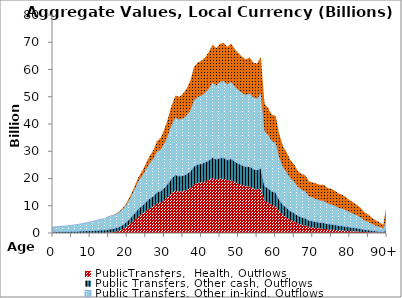
| Category | PublicTransfers,  Health, Outflows | Public Transfers, Other cash, Outflows | Public Transfers, Other in-kind, Outflows | Public Transfers, Education, Outflows |
|---|---|---|---|---|
| 0 | 0 | 473.343 | 1725.737 | 0 |
|  | 0 | 495.483 | 1806.456 | 0 |
| 2 | 0 | 530.702 | 1934.861 | 0 |
| 3 | 0 | 539.497 | 1966.926 | 0 |
| 4 | 0 | 565.119 | 2060.34 | 0 |
| 5 | 0 | 601.158 | 2191.732 | 0 |
| 6 | 0 | 642.344 | 2341.89 | 0 |
| 7 | 0 | 694.89 | 2533.466 | 0 |
| 8 | 0 | 749.066 | 2730.981 | 0 |
| 9 | 0 | 801.977 | 2923.888 | 0 |
| 10 | 0 | 870.494 | 3173.69 | 0 |
| 11 | 0 | 940.325 | 3428.285 | 0 |
| 12 | 0 | 1019.607 | 3717.333 | 0 |
| 13 | 0 | 1101.743 | 4016.789 | 0 |
| 14 | 0 | 1118.584 | 4078.189 | 0 |
| 15 | 123.052 | 1276.672 | 4654.556 | 30.855 |
| 16 | 243.058 | 1321.502 | 4818 | 65.382 |
| 17 | 488.22 | 1389.304 | 5065.194 | 140.833 |
| 18 | 922.684 | 1483.082 | 5407.097 | 272.293 |
| 19 | 1572.959 | 1587.089 | 5786.292 | 428.647 |
| 20 | 2517.777 | 1809.674 | 6597.798 | 615.915 |
| 21 | 3642.692 | 2078.601 | 7578.269 | 846.401 |
| 22 | 4881.677 | 2419.588 | 8821.455 | 1077.61 |
| 23 | 6121.604 | 2769.889 | 10098.6 | 1408.981 |
| 24 | 7040.591 | 2999.173 | 10934.539 | 1736.013 |
| 25 | 8022.767 | 3272.88 | 11932.431 | 2141.912 |
| 26 | 9024.517 | 3573.816 | 13029.598 | 2587.573 |
| 27 | 9728.164 | 3752.775 | 13682.055 | 3060.888 |
| 28 | 10858.4 | 4097.859 | 14940.189 | 3770.454 |
| 29 | 11239.76 | 4169.141 | 15200.07 | 4298.453 |
| 30 | 12141.252 | 4453.163 | 16235.557 | 5174.554 |
| 31 | 13352.646 | 4884.409 | 17807.825 | 6092.501 |
| 32 | 14730.764 | 5406.561 | 19711.516 | 7181.691 |
| 33 | 15608.759 | 5781.98 | 21080.237 | 7965.506 |
| 34 | 15222.742 | 5676.754 | 20696.593 | 8346.756 |
| 35 | 15369.639 | 5755.474 | 20983.601 | 8935.525 |
| 36 | 15755.172 | 5879.73 | 21436.609 | 9880.511 |
| 37 | 16506.831 | 6144.656 | 22402.5 | 10841.471 |
| 38 | 17903.228 | 6619.066 | 24132.133 | 12264.66 |
| 39 | 18417.139 | 6786.09 | 24741.075 | 12661.528 |
| 40 | 18616.672 | 6841.68 | 24943.741 | 12805.701 |
| 41 | 18978.143 | 6999.089 | 25517.634 | 12930.069 |
| 42 | 19492.546 | 7217.983 | 26315.679 | 13390.87 |
| 43 | 20151.112 | 7533.617 | 27466.435 | 13918.281 |
| 44 | 19644.629 | 7433.854 | 27102.711 | 13693.497 |
| 45 | 19926.167 | 7650.215 | 27891.538 | 13931.209 |
| 46 | 19893.94 | 7732.322 | 28190.886 | 14031.947 |
| 47 | 19291.758 | 7588.762 | 27667.486 | 13723.938 |
| 48 | 19493.275 | 7745.604 | 28239.319 | 14033.999 |
| 49 | 18735.867 | 7525.896 | 27438.292 | 13714.711 |
| 50 | 18142.488 | 7385.041 | 26924.755 | 13533.489 |
| 51 | 17576.497 | 7278.137 | 26534.995 | 13243.809 |
| 52 | 17104.579 | 7223.62 | 26336.244 | 13021.485 |
| 53 | 17068.359 | 7375.221 | 26888.958 | 13108.256 |
| 54 | 16308.222 | 7197.304 | 26240.287 | 12762.407 |
| 55 | 15962.039 | 7195.686 | 26234.398 | 12788.248 |
| 56 | 16336.086 | 7504.032 | 27358.575 | 13551.651 |
| 57 | 11785.069 | 5517.852 | 20117.264 | 10093.217 |
| 58 | 11142.241 | 5322.384 | 19404.62 | 9937.252 |
| 59 | 10283.939 | 5054.308 | 18427.253 | 9631.705 |
| 60 | 9852.324 | 5018.027 | 18294.982 | 9792.396 |
| 61 | 7910.587 | 4247.789 | 15486.805 | 8429.353 |
| 62 | 6583.27 | 3782.696 | 13791.144 | 7624.972 |
| 63 | 5690.138 | 3549.267 | 12940.096 | 7206.998 |
| 64 | 4816.669 | 3284.308 | 11974.09 | 6628.175 |
| 65 | 4184.445 | 3139.586 | 11446.462 | 6313.102 |
| 66 | 3500.435 | 2883.549 | 10512.988 | 5860.509 |
| 67 | 3057.751 | 2764.668 | 10079.567 | 5762.492 |
| 68 | 2742.726 | 2704.066 | 9858.616 | 5825.362 |
| 69 | 2248.334 | 2419.797 | 8822.219 | 5419.418 |
| 70 | 2022.275 | 2361.016 | 8607.907 | 5576.106 |
| 71 | 1816.971 | 2288.716 | 8344.317 | 5645.79 |
| 72 | 1648.334 | 2221.417 | 8098.955 | 5722.725 |
| 73 | 1534.708 | 2205.845 | 8042.18 | 5928.246 |
| 74 | 1338.678 | 2038.068 | 7430.491 | 5713.671 |
| 75 | 1234.868 | 1990.292 | 7256.312 | 5707.609 |
| 76 | 1113.753 | 1897.364 | 6917.505 | 5522.683 |
| 77 | 990.479 | 1783.197 | 6501.267 | 5242.211 |
| 78 | 908.301 | 1725.42 | 6290.619 | 5104.85 |
| 79 | 800.95 | 1604.128 | 5848.412 | 4772.335 |
| 80 | 691.104 | 1486.116 | 5418.156 | 4378.142 |
| 81 | 608.215 | 1390.766 | 5070.526 | 4111.269 |
| 82 | 522.368 | 1268.788 | 4625.81 | 3756.251 |
| 83 | 443.731 | 1123.614 | 4096.527 | 3402.68 |
| 84 | 345.07 | 925.427 | 3373.969 | 2830.7 |
| 85 | 296.116 | 819.941 | 2989.382 | 2609.535 |
| 86 | 234.001 | 664.145 | 2421.372 | 2212.107 |
| 87 | 192.186 | 540.666 | 1971.186 | 1936.39 |
| 88 | 161.27 | 435.866 | 1589.101 | 1705.281 |
| 89 | 130.267 | 330.53 | 1205.062 | 1439.751 |
| 90+ | 467.808 | 1115.362 | 4066.444 | 5395.332 |